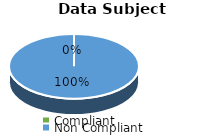
| Category | Series 7 | Series 6 | Series 5 | Series 4 | Series 3 | Series 2 | Series 1 | Series 0 |
|---|---|---|---|---|---|---|---|---|
| Compliant | 0 | 0 | 0 | 0 | 0 | 0 | 0 | 0 |
| Non Compliant | 5 | 13 | 8 | 4 | 4 | 8 | 9 | 10 |